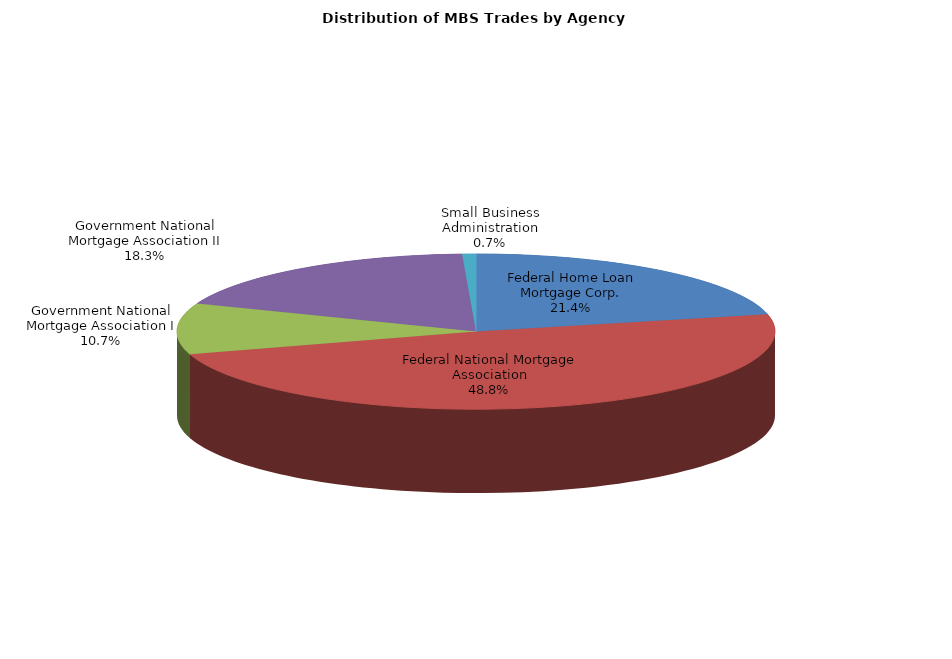
| Category | Series 0 |
|---|---|
| Federal Home Loan Mortgage Corp. | 640.706 |
| Federal National Mortgage Association | 1460.143 |
| Government National Mortgage Association I | 318.54 |
| Government National Mortgage Association II | 548.31 |
| Small Business Administration | 22.163 |